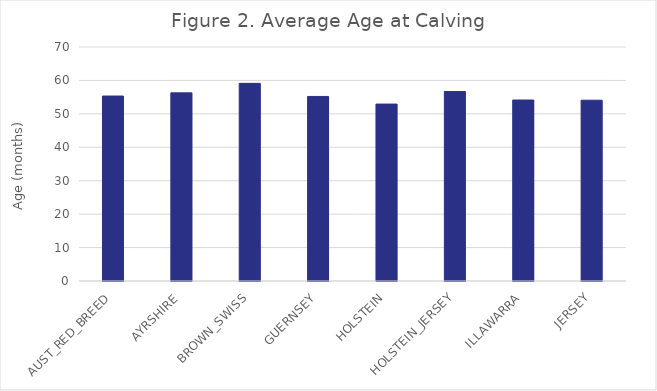
| Category | Average |
|---|---|
| AUST_RED_BREED | 55.33 |
| AYRSHIRE | 56.28 |
| BROWN_SWISS | 59.12 |
| GUERNSEY | 55.21 |
| HOLSTEIN | 52.93 |
| HOLSTEIN_JERSEY | 56.68 |
| ILLAWARRA | 54.14 |
| JERSEY | 54.08 |